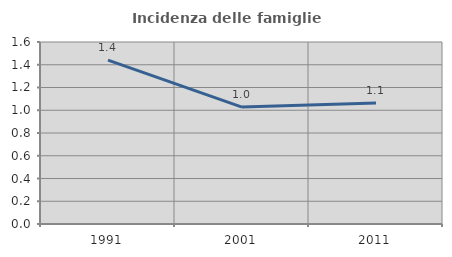
| Category | Incidenza delle famiglie numerose |
|---|---|
| 1991.0 | 1.44 |
| 2001.0 | 1.028 |
| 2011.0 | 1.064 |